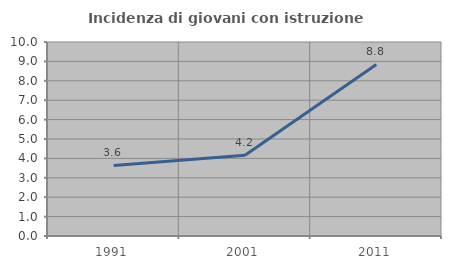
| Category | Incidenza di giovani con istruzione universitaria |
|---|---|
| 1991.0 | 3.636 |
| 2001.0 | 4.167 |
| 2011.0 | 8.844 |